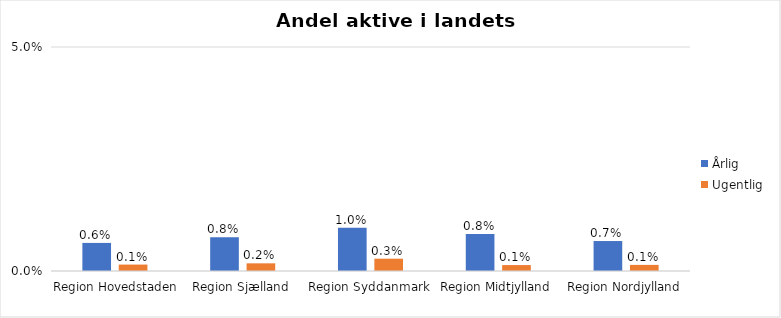
| Category | Årlig | Ugentlig |
|---|---|---|
| Region Hovedstaden | 0.006 | 0.001 |
| Region Sjælland | 0.008 | 0.002 |
| Region Syddanmark | 0.01 | 0.003 |
| Region Midtjylland | 0.008 | 0.001 |
| Region Nordjylland | 0.007 | 0.001 |